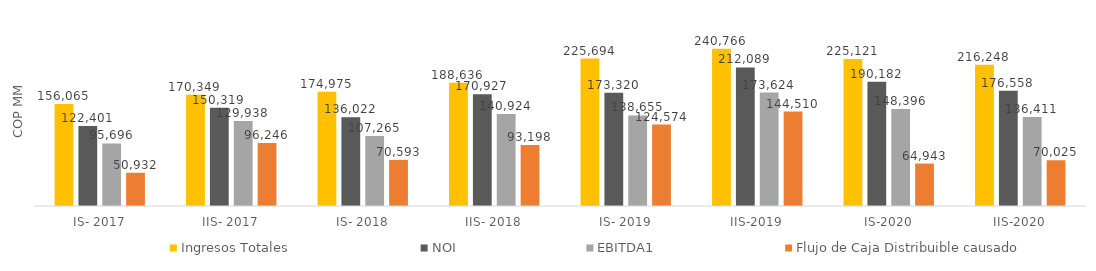
| Category | Ingresos Totales | NOI | EBITDA1 | Flujo de Caja Distribuible causado |
|---|---|---|---|---|
| IS- 2017 | 156065 | 122401 | 95696 | 50931.746 |
| IIS- 2017 | 170349 | 150319 | 129938 | 96245.929 |
| IS- 2018 | 174975.027 | 136021.779 | 107264.779 | 70592.584 |
| IIS- 2018 | 188636.473 | 170927.038 | 140924.038 | 93198.182 |
| IS- 2019 | 225693.692 | 173319.729 | 138654.729 | 124574.397 |
| IIS-2019 | 240766 | 212089 | 173624 | 144510 |
| IS-2020 | 225121 | 190182 | 148396 | 64943 |
| IIS-2020 | 216248 | 176557.593 | 136411.288 | 70024.784 |